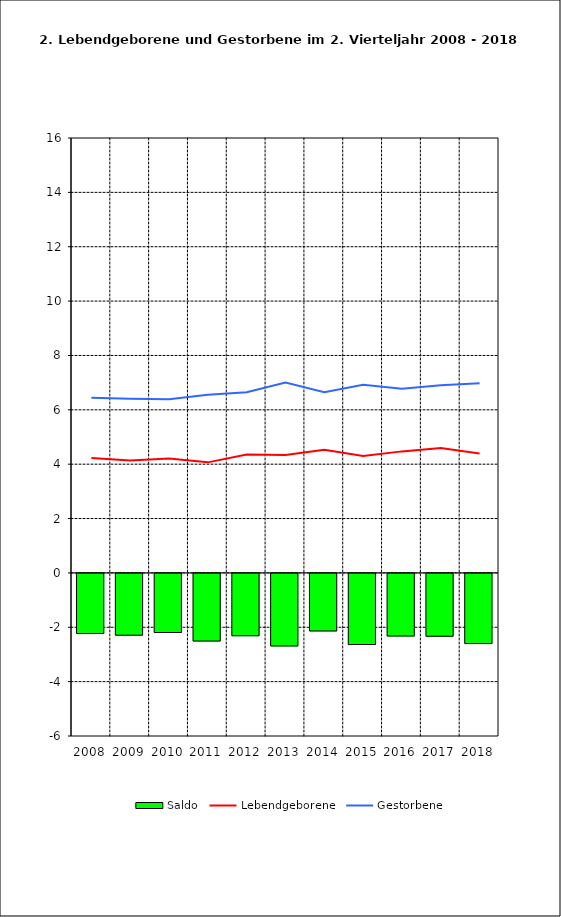
| Category | Saldo |
|---|---|
| 2005.0 | -2.212 |
| 2006.0 | -2.273 |
| 2007.0 | -2.175 |
| 2008.0 | -2.488 |
| 2009.0 | -2.293 |
| 2010.0 | -2.669 |
| 2011.0 | -2.117 |
| 2012.0 | -2.616 |
| 2013.0 | -2.303 |
| 2014.0 | -2.312 |
| 2015.0 | -2.581 |